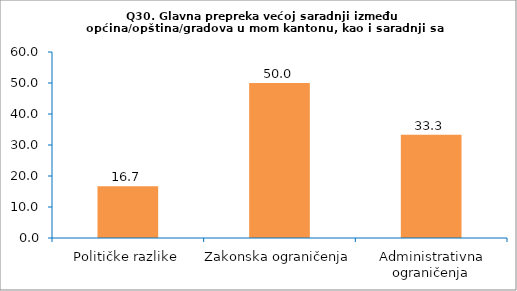
| Category | Series 0 |
|---|---|
| Političke razlike | 16.667 |
| Zakonska ograničenja | 50 |
| Administrativna ograničenja | 33.333 |